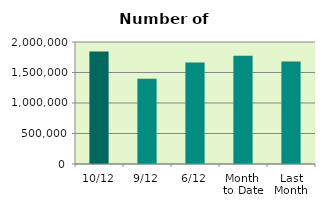
| Category | Series 0 |
|---|---|
| 10/12 | 1842806 |
| 9/12 | 1397358 |
| 6/12 | 1661996 |
| Month 
to Date | 1776257.714 |
| Last
Month | 1681386.857 |